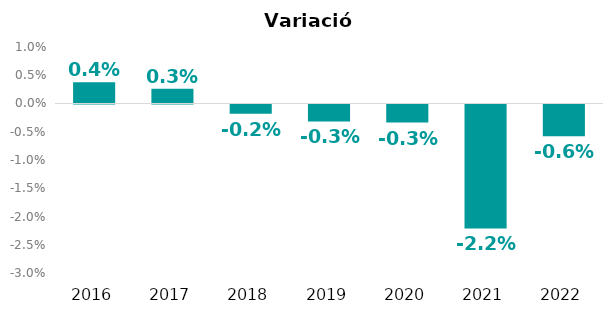
| Category | Variació interanual |
|---|---|
| 2016.0 | 0.004 |
| 2017.0 | 0.003 |
| 2018.0 | -0.002 |
| 2019.0 | -0.003 |
| 2020.0 | -0.003 |
| 2021.0 | -0.022 |
| 2022.0 | -0.006 |